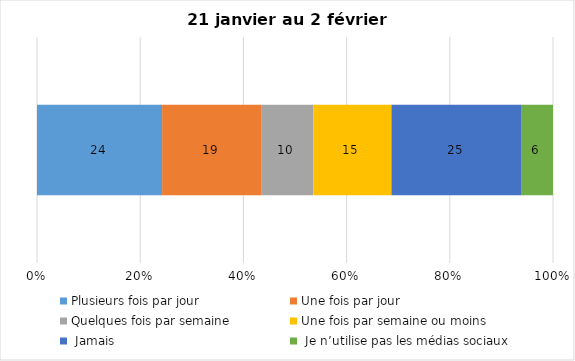
| Category | Plusieurs fois par jour | Une fois par jour | Quelques fois par semaine   | Une fois par semaine ou moins   |  Jamais   |  Je n’utilise pas les médias sociaux |
|---|---|---|---|---|---|---|
| 0 | 24 | 19 | 10 | 15 | 25 | 6 |